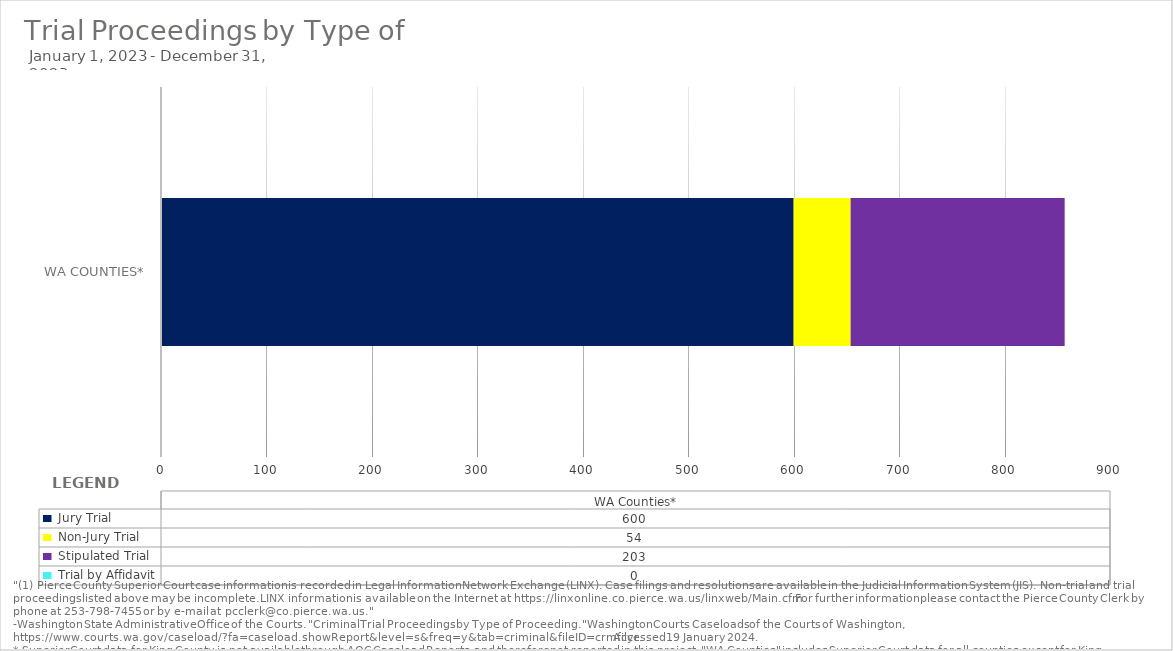
| Category |  Jury Trial  |  Non-Jury Trial  |  Stipulated Trial  |  Trial by Affidavit  |
|---|---|---|---|---|
|  WA Counties* | 600 | 54 | 203 | 0 |